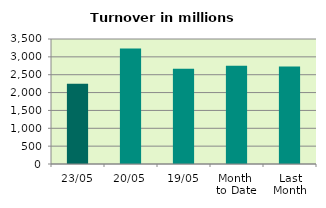
| Category | Series 0 |
|---|---|
| 23/05 | 2249.856 |
| 20/05 | 3235.526 |
| 19/05 | 2669.863 |
| Month 
to Date | 2750.87 |
| Last
Month | 2727.753 |